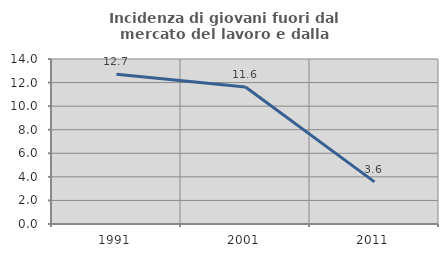
| Category | Incidenza di giovani fuori dal mercato del lavoro e dalla formazione  |
|---|---|
| 1991.0 | 12.698 |
| 2001.0 | 11.628 |
| 2011.0 | 3.571 |